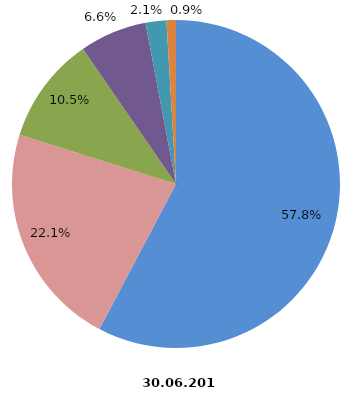
| Category | Anzahl Betriebe 2017 |
|---|---|
| 1 - 4 Beschäftigte | 1743 |
| 5 - 9 Beschäftigte | 668 |
| 10 - 19 Beschäftigte | 318 |
| 20 - 49 Beschäftigte | 200 |
| 50 - 99 Beschäftigte | 62 |
| 100 und mehr Beschäftigte | 28 |